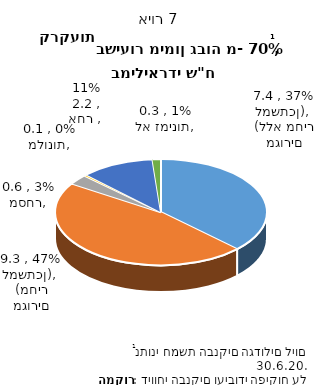
| Category | Series 0 |
|---|---|
| מגורים (ללא מחיר למשתכן) | 7.369 |
| מגורים (מחיר למשתכן) | 9.26 |
| מסחר | 0.599 |
| מלונות | 0.083 |
| אחר  | 2.212 |
| לא זמינות | 0.256 |